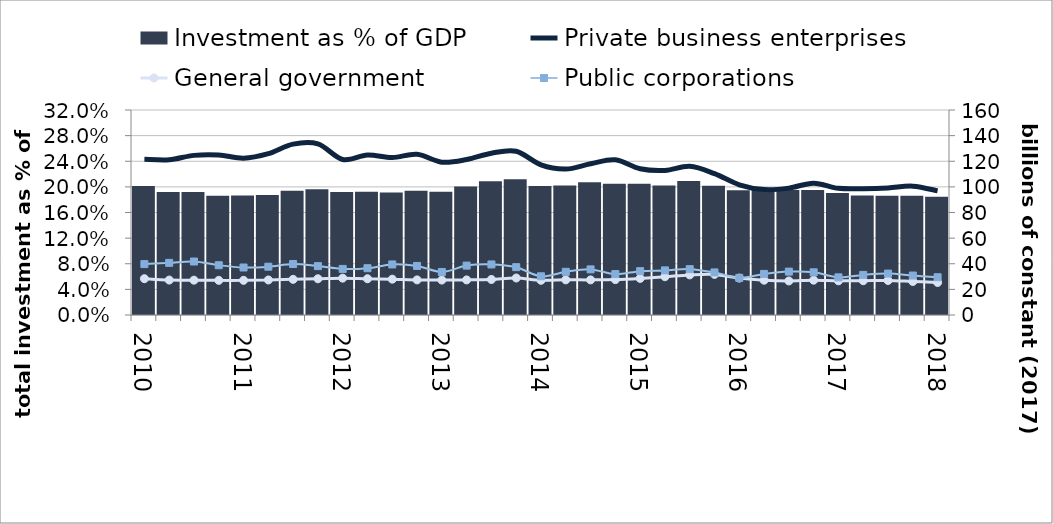
| Category | Investment as % of GDP |
|---|---|
| 2010.0 | 0.201 |
| nan | 0.192 |
| nan | 0.192 |
| nan | 0.186 |
| 2011.0 | 0.186 |
| nan | 0.187 |
| nan | 0.194 |
| nan | 0.196 |
| 2012.0 | 0.192 |
| nan | 0.192 |
| nan | 0.191 |
| nan | 0.194 |
| 2013.0 | 0.192 |
| nan | 0.201 |
| nan | 0.209 |
| nan | 0.212 |
| 2014.0 | 0.201 |
| nan | 0.202 |
| nan | 0.207 |
| nan | 0.205 |
| 2015.0 | 0.205 |
| nan | 0.202 |
| nan | 0.209 |
| nan | 0.202 |
| 2016.0 | 0.195 |
| nan | 0.196 |
| nan | 0.195 |
| nan | 0.195 |
| 2017.0 | 0.191 |
| nan | 0.186 |
| nan | 0.186 |
| nan | 0.186 |
| 2018.0 | 0.185 |